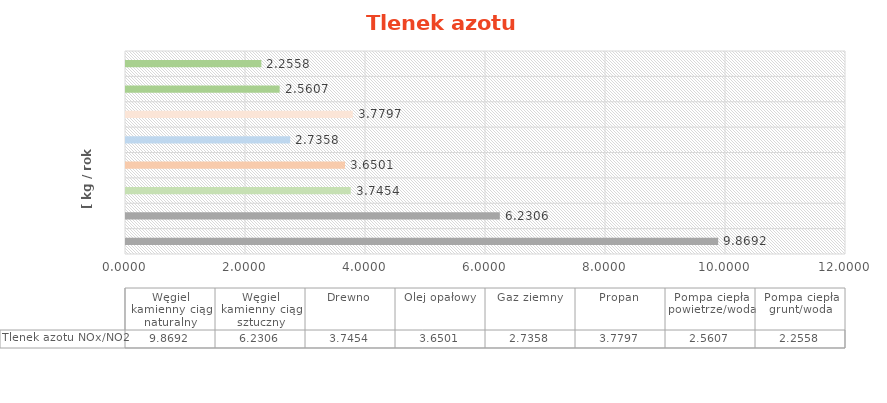
| Category | Tlenek azotu |
|---|---|
| Węgiel kamienny ciąg naturalny | 9.869 |
| Węgiel kamienny ciąg sztuczny | 6.231 |
| Drewno | 3.745 |
| Olej opałowy | 3.65 |
| Gaz ziemny | 2.736 |
| Propan | 3.78 |
| Pompa ciepła powietrze/woda | 2.561 |
| Pompa ciepła grunt/woda | 2.256 |